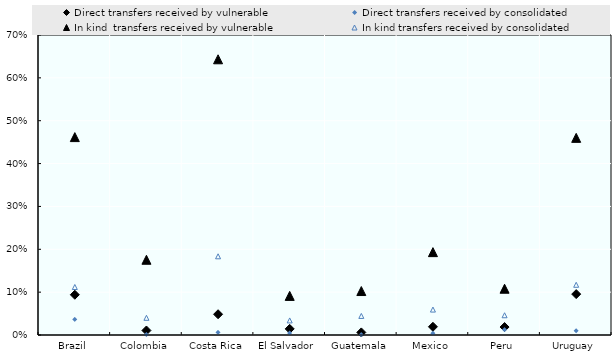
| Category | Direct transfers received by vulnerable  | Direct transfers received by consolidated  | In kind  transfers received by vulnerable  | In kind transfers received by consolidated |
|---|---|---|---|---|
| Brazil | 0.094 | 0.036 | 0.462 | 0.112 |
| Colombia | 0.011 | 0.001 | 0.176 | 0.04 |
| Costa Rica | 0.048 | 0.006 | 0.643 | 0.184 |
| El Salvador | 0.014 | 0.005 | 0.091 | 0.034 |
| Guatemala | 0.006 | 0.001 | 0.103 | 0.045 |
| Mexico | 0.019 | 0.004 | 0.193 | 0.059 |
| Peru | 0.019 | 0.012 | 0.108 | 0.046 |
| Uruguay | 0.095 | 0.01 | 0.46 | 0.117 |